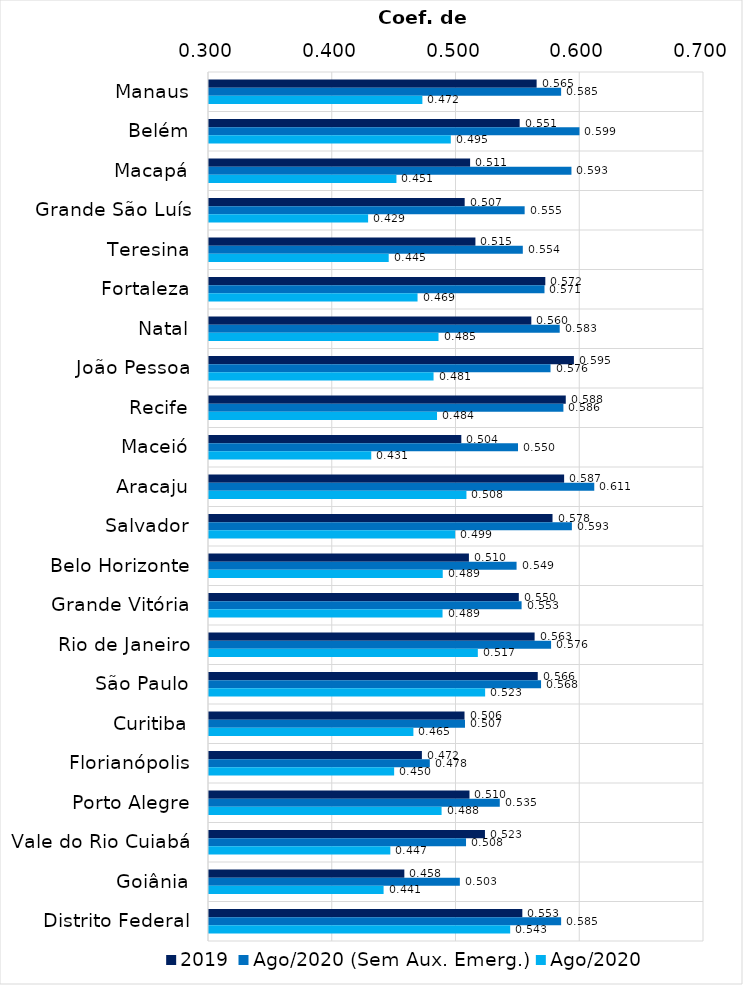
| Category | 2019 | Ago/2020 (Sem Aux. Emerg.) | Ago/2020 |
|---|---|---|---|
| Manaus | 0.565 | 0.585 | 0.472 |
| Belém | 0.551 | 0.599 | 0.495 |
| Macapá | 0.511 | 0.593 | 0.451 |
| Grande São Luís | 0.507 | 0.555 | 0.429 |
| Teresina | 0.515 | 0.554 | 0.445 |
| Fortaleza | 0.572 | 0.571 | 0.469 |
| Natal | 0.56 | 0.583 | 0.485 |
| João Pessoa | 0.595 | 0.576 | 0.481 |
| Recife | 0.588 | 0.586 | 0.484 |
| Maceió | 0.504 | 0.55 | 0.431 |
| Aracaju | 0.587 | 0.611 | 0.508 |
| Salvador | 0.578 | 0.593 | 0.499 |
| Belo Horizonte | 0.51 | 0.549 | 0.489 |
| Grande Vitória | 0.55 | 0.553 | 0.489 |
| Rio de Janeiro | 0.563 | 0.576 | 0.517 |
| São Paulo | 0.566 | 0.568 | 0.523 |
| Curitiba | 0.506 | 0.507 | 0.465 |
| Florianópolis | 0.472 | 0.478 | 0.45 |
| Porto Alegre | 0.51 | 0.535 | 0.488 |
| Vale do Rio Cuiabá | 0.523 | 0.508 | 0.447 |
| Goiânia | 0.458 | 0.503 | 0.441 |
| Distrito Federal | 0.553 | 0.585 | 0.543 |